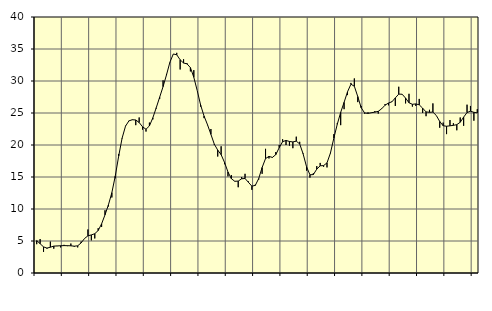
| Category | Piggar | Series 1 |
|---|---|---|
| nan | 4.5 | 5.07 |
| 87.0 | 5.3 | 4.58 |
| 87.0 | 3.3 | 4.08 |
| 87.0 | 3.8 | 3.89 |
| nan | 4.9 | 4.03 |
| 88.0 | 3.8 | 4.2 |
| 88.0 | 4.2 | 4.23 |
| 88.0 | 4 | 4.26 |
| nan | 4.4 | 4.28 |
| 89.0 | 4.2 | 4.27 |
| 89.0 | 4.6 | 4.25 |
| 89.0 | 4.1 | 4.19 |
| nan | 4 | 4.25 |
| 90.0 | 4.9 | 4.7 |
| 90.0 | 5.4 | 5.39 |
| 90.0 | 6.8 | 5.81 |
| nan | 5.1 | 5.95 |
| 91.0 | 5.4 | 6.14 |
| 91.0 | 7 | 6.64 |
| 91.0 | 7.2 | 7.68 |
| nan | 9.8 | 9.09 |
| 92.0 | 10.4 | 10.65 |
| 92.0 | 11.8 | 12.55 |
| 92.0 | 14.8 | 15.14 |
| nan | 18.6 | 18.26 |
| 93.0 | 21 | 21.06 |
| 93.0 | 23 | 22.94 |
| 93.0 | 23.8 | 23.77 |
| nan | 23.9 | 23.95 |
| 94.0 | 23.1 | 23.91 |
| 94.0 | 24.3 | 23.51 |
| 94.0 | 22.4 | 22.84 |
| nan | 22.1 | 22.46 |
| 95.0 | 23.5 | 22.98 |
| 95.0 | 24 | 24.25 |
| 95.0 | 25.7 | 25.82 |
| nan | 27.2 | 27.47 |
| 96.0 | 30.1 | 29.12 |
| 96.0 | 31.1 | 30.95 |
| 96.0 | 32.9 | 32.94 |
| nan | 34.2 | 34.22 |
| 97.0 | 34.4 | 34.1 |
| 97.0 | 31.8 | 33.31 |
| 97.0 | 33.4 | 32.81 |
| nan | 32.8 | 32.68 |
| 98.0 | 31.5 | 32.09 |
| 98.0 | 31.7 | 30.58 |
| 98.0 | 28.5 | 28.5 |
| nan | 26 | 26.23 |
| 99.0 | 24.2 | 24.52 |
| 99.0 | 23.1 | 23.18 |
| 99.0 | 22.5 | 21.67 |
| nan | 20 | 20.13 |
| 0.0 | 18.2 | 19.2 |
| 0.0 | 19.8 | 18.49 |
| 0.0 | 17 | 17.27 |
| nan | 15.1 | 15.78 |
| 1.0 | 15.3 | 14.73 |
| 1.0 | 14.3 | 14.33 |
| 1.0 | 13.4 | 14.36 |
| nan | 15 | 14.72 |
| 2.0 | 15.5 | 14.77 |
| 2.0 | 14.3 | 14.16 |
| 2.0 | 13 | 13.57 |
| nan | 13.8 | 13.69 |
| 3.0 | 14.6 | 14.76 |
| 3.0 | 15.5 | 16.48 |
| 3.0 | 19.4 | 17.88 |
| nan | 17.9 | 18.22 |
| 4.0 | 18 | 18.06 |
| 4.0 | 18.9 | 18.49 |
| 4.0 | 20 | 19.58 |
| nan | 20.9 | 20.52 |
| 5.0 | 20 | 20.71 |
| 5.0 | 19.9 | 20.55 |
| 5.0 | 19.5 | 20.48 |
| nan | 21.3 | 20.6 |
| 6.0 | 20.5 | 20.17 |
| 6.0 | 18.7 | 18.62 |
| 6.0 | 16 | 16.62 |
| nan | 14.9 | 15.34 |
| 7.0 | 15.6 | 15.38 |
| 7.0 | 16.7 | 16.23 |
| 7.0 | 17.2 | 16.75 |
| nan | 16.6 | 16.78 |
| 8.0 | 16.5 | 17.21 |
| 8.0 | 18.7 | 18.74 |
| 8.0 | 21.7 | 21.08 |
| nan | 23.4 | 23.23 |
| 9.0 | 23.1 | 25.1 |
| 9.0 | 25.6 | 26.66 |
| 9.0 | 27.8 | 28.31 |
| nan | 29.7 | 29.5 |
| 10.0 | 30.4 | 29.18 |
| 10.0 | 26.7 | 27.57 |
| 10.0 | 26.1 | 25.83 |
| nan | 24.9 | 25.01 |
| 11.0 | 25.1 | 24.94 |
| 11.0 | 25 | 25.04 |
| 11.0 | 25.3 | 25.13 |
| nan | 24.9 | 25.26 |
| 12.0 | 25.7 | 25.66 |
| 12.0 | 26.4 | 26.22 |
| 12.0 | 26.2 | 26.56 |
| nan | 26.8 | 26.75 |
| 13.0 | 26.1 | 27.36 |
| 13.0 | 29.1 | 27.95 |
| 13.0 | 27.9 | 27.93 |
| nan | 26.5 | 27.33 |
| 14.0 | 28 | 26.6 |
| 14.0 | 26 | 26.36 |
| 14.0 | 26.1 | 26.42 |
| nan | 27.2 | 26.28 |
| 15.0 | 25 | 25.75 |
| 15.0 | 24.5 | 25.17 |
| 15.0 | 25.5 | 25.11 |
| nan | 26.5 | 25.14 |
| 16.0 | 24.6 | 24.61 |
| 16.0 | 22.7 | 23.68 |
| 16.0 | 23.5 | 23.01 |
| nan | 21.7 | 22.93 |
| 17.0 | 23.9 | 23 |
| 17.0 | 23.4 | 23.07 |
| 17.0 | 22.3 | 23.18 |
| nan | 24.3 | 23.55 |
| 18.0 | 23 | 24.36 |
| 18.0 | 26.3 | 25.07 |
| 18.0 | 26.1 | 25.28 |
| nan | 23.8 | 25.11 |
| 19.0 | 25.6 | 25.02 |